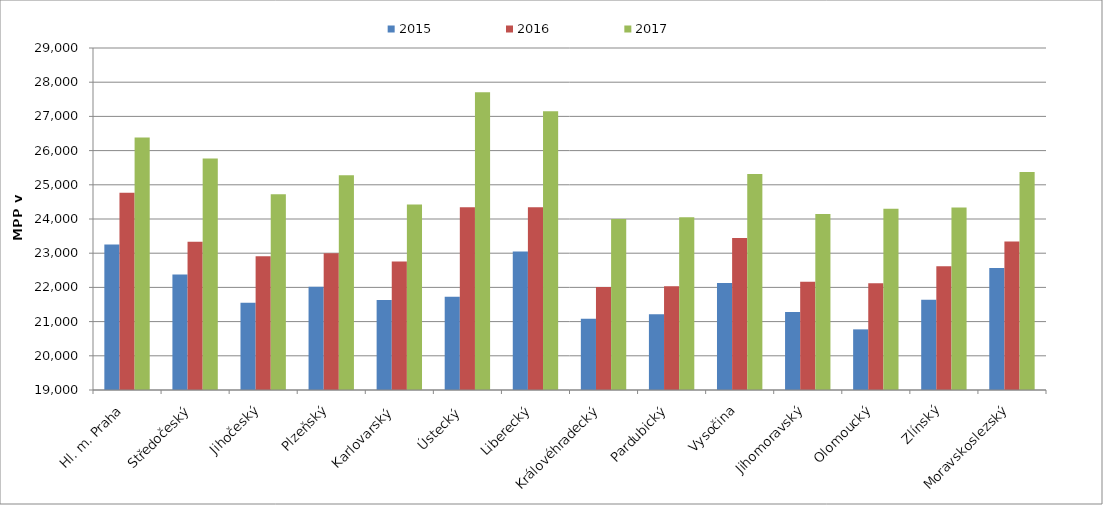
| Category | 2015 | 2016 | 2017 |
|---|---|---|---|
| Hl. m. Praha | 23251.762 | 24770.878 | 26383 |
| Středočeský | 22377.562 | 23331.84 | 25768.792 |
| Jihočeský | 21550.707 | 22908.82 | 24725.5 |
| Plzeňský | 22018.868 | 23000 | 25276.8 |
| Karlovarský  | 21630.901 | 22759.044 | 24426.732 |
| Ústecký   | 21724.24 | 24340.816 | 27709.589 |
| Liberecký | 23046.908 | 24345.26 | 27149.717 |
| Královéhradecký | 21084.382 | 22013.729 | 24000 |
| Pardubický | 21218.438 | 22033.133 | 24053.04 |
| Vysočina | 22127.464 | 23443.051 | 25318.659 |
| Jihomoravský | 21279.939 | 22164.489 | 24147.751 |
| Olomoucký | 20772.908 | 22121.116 | 24297.569 |
| Zlínský | 21636.172 | 22620.239 | 24338.598 |
| Moravskoslezský | 22565.718 | 23344.509 | 25372.442 |